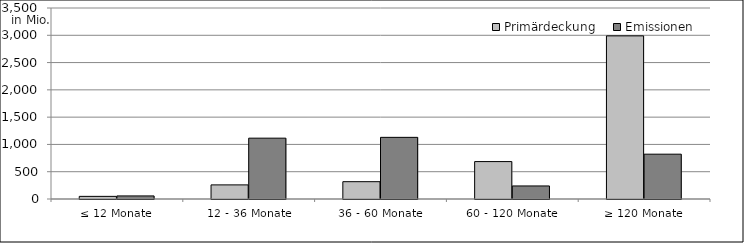
| Category | Primärdeckung | Emissionen |
|---|---|---|
| ≤ 12 Monate | 48175419.99 | 56463729.97 |
| 12 - 36 Monate | 258595872.45 | 1114828420.78 |
| 36 - 60 Monate | 317525942.757 | 1129783788.5 |
| 60 - 120 Monate | 685489771.527 | 239150000 |
| ≥ 120 Monate | 2989365803.739 | 821449155.66 |